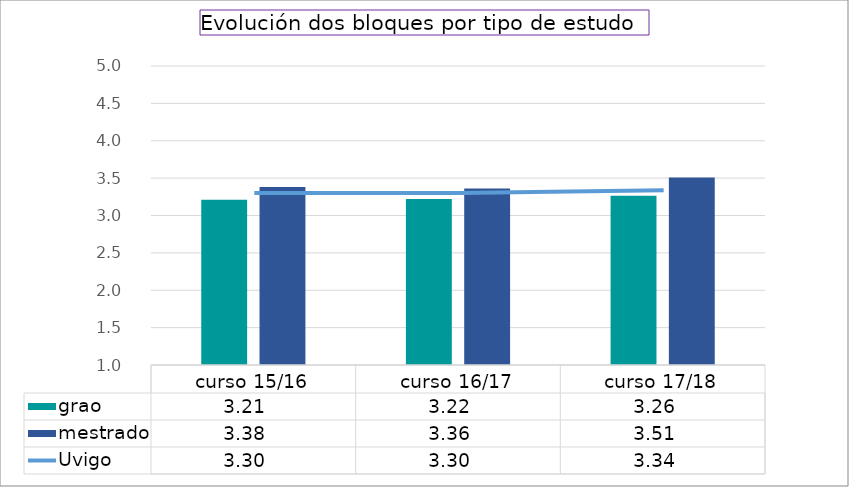
| Category | grao | mestrado |
|---|---|---|
| curso 15/16 | 3.21 | 3.38 |
| curso 16/17 | 3.22 | 3.36 |
| curso 17/18 | 3.264 | 3.509 |